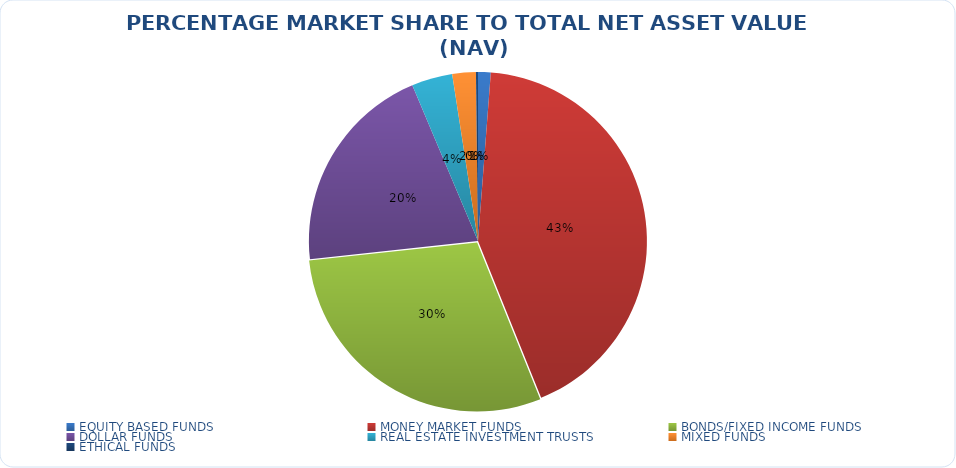
| Category | NET ASSET VALUE |
|---|---|
| EQUITY BASED FUNDS | 15542804259.49 |
| MONEY MARKET FUNDS | 548428396659.736 |
| BONDS/FIXED INCOME FUNDS | 377444877891.82 |
| DOLLAR FUNDS | 261527720350.767 |
| REAL ESTATE INVESTMENT TRUSTS | 50174533421.04 |
| MIXED FUNDS | 28917512522.091 |
| ETHICAL FUNDS | 2488383973.49 |